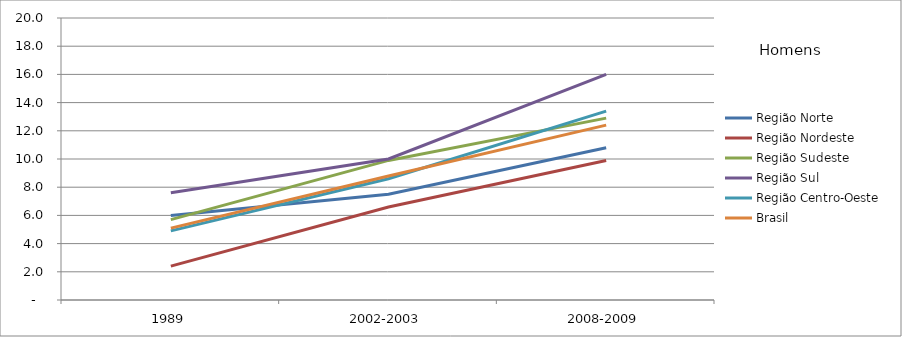
| Category | Região Norte | Região Nordeste | Região Sudeste | Região Sul | Região Centro-Oeste | Brasil |
|---|---|---|---|---|---|---|
| 1989 | 6 | 2.4 | 5.7 | 7.6 | 4.9 | 5.1 |
| 2002-2003 | 7.5 | 6.6 | 9.9 | 10 | 8.6 | 8.8 |
| 2008-2009 | 10.8 | 9.9 | 12.9 | 16 | 13.4 | 12.4 |